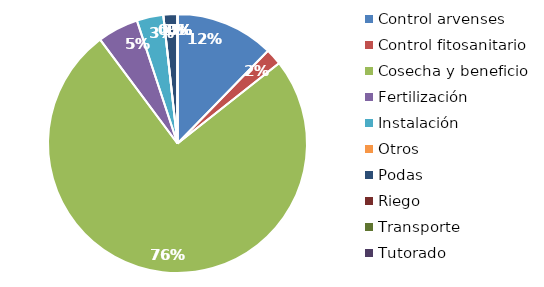
| Category | Valor |
|---|---|
| Control arvenses | 6403000 |
| Control fitosanitario | 1064000 |
| Cosecha y beneficio | 39266000 |
| Fertilización | 2660000 |
| Instalación | 1729000 |
| Otros | 0 |
| Podas | 912000 |
| Riego | 0 |
| Transporte | 0 |
| Tutorado | 0 |